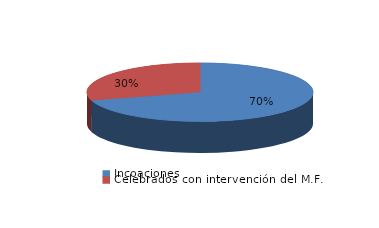
| Category | Series 0 |
|---|---|
| Incoaciones | 2280 |
| Celebrados con intervención del M.F. | 960 |